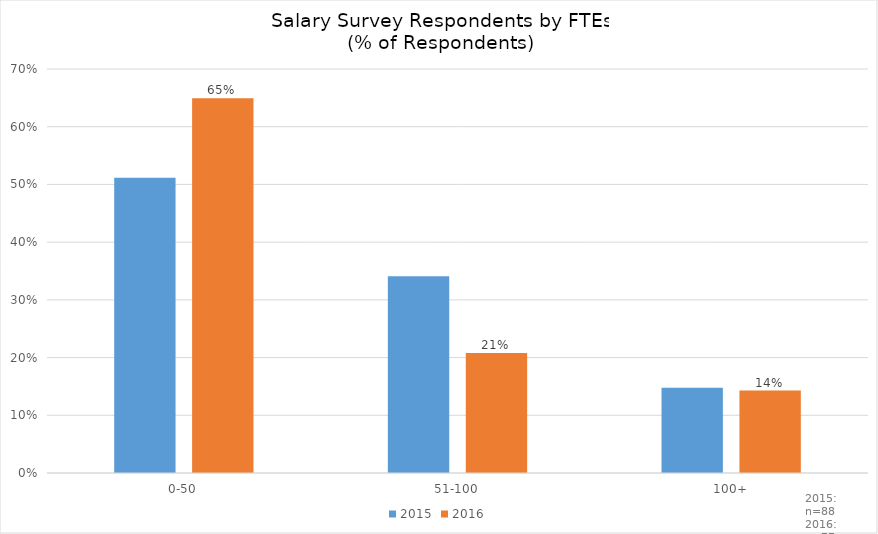
| Category | 2015 | 2016 |
|---|---|---|
| 0-50 | 0.511 | 0.649 |
| 51-100 | 0.341 | 0.208 |
| 100+ | 0.148 | 0.143 |